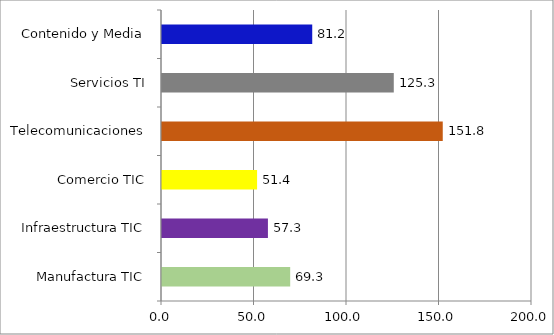
| Category | Series 0 |
|---|---|
| Manufactura TIC | 69.294 |
| Infraestructura TIC | 57.256 |
| Comercio TIC | 51.396 |
| Telecomunicaciones | 151.761 |
| Servicios TI | 125.286 |
| Contenido y Media | 81.208 |